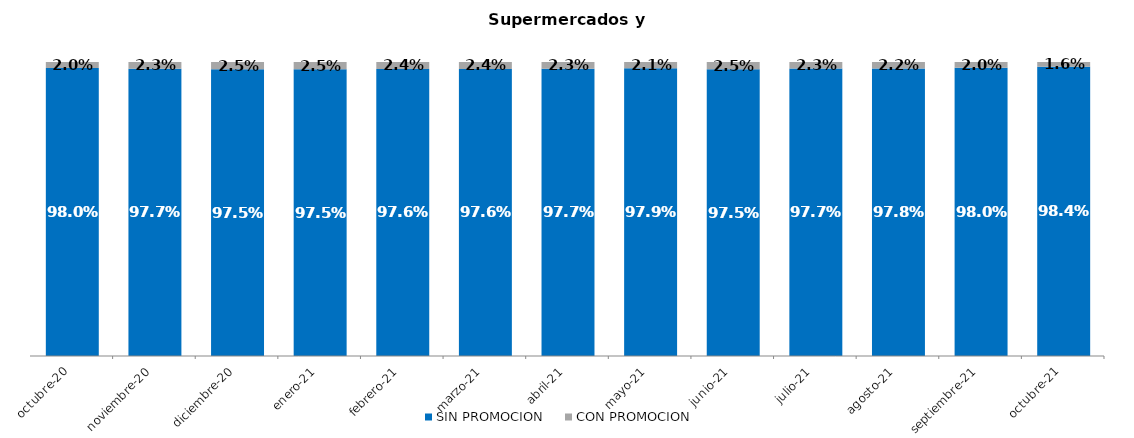
| Category | SIN PROMOCION   | CON PROMOCION   |
|---|---|---|
| 2020-10-01 | 0.98 | 0.02 |
| 2020-11-01 | 0.977 | 0.023 |
| 2020-12-01 | 0.975 | 0.025 |
| 2021-01-01 | 0.975 | 0.025 |
| 2021-02-01 | 0.976 | 0.024 |
| 2021-03-01 | 0.976 | 0.024 |
| 2021-04-01 | 0.977 | 0.023 |
| 2021-05-01 | 0.979 | 0.021 |
| 2021-06-01 | 0.975 | 0.025 |
| 2021-07-01 | 0.977 | 0.023 |
| 2021-08-01 | 0.978 | 0.022 |
| 2021-09-01 | 0.98 | 0.02 |
| 2021-10-01 | 0.984 | 0.016 |